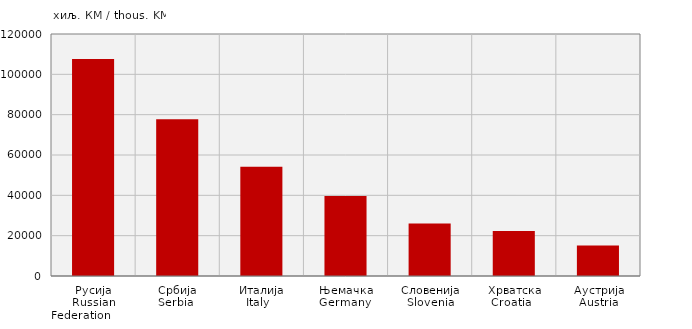
| Category | Увоз
Import |
|---|---|
| Русија
Russian Federation             | 107564 |
| Србија
Serbia  | 77719 |
| Италија
Italy   | 54205 |
| Њемачка
Germany  | 39624 |
| Словенија
Slovenia | 26067 |
| Хрватска
Croatia   | 22301 |
| Аустрија
Austria | 15066 |